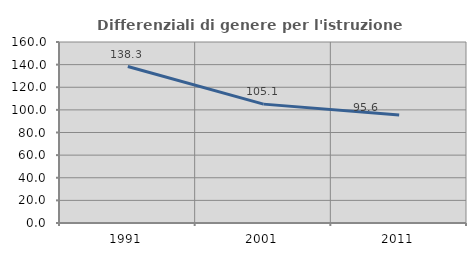
| Category | Differenziali di genere per l'istruzione superiore |
|---|---|
| 1991.0 | 138.332 |
| 2001.0 | 105.079 |
| 2011.0 | 95.561 |